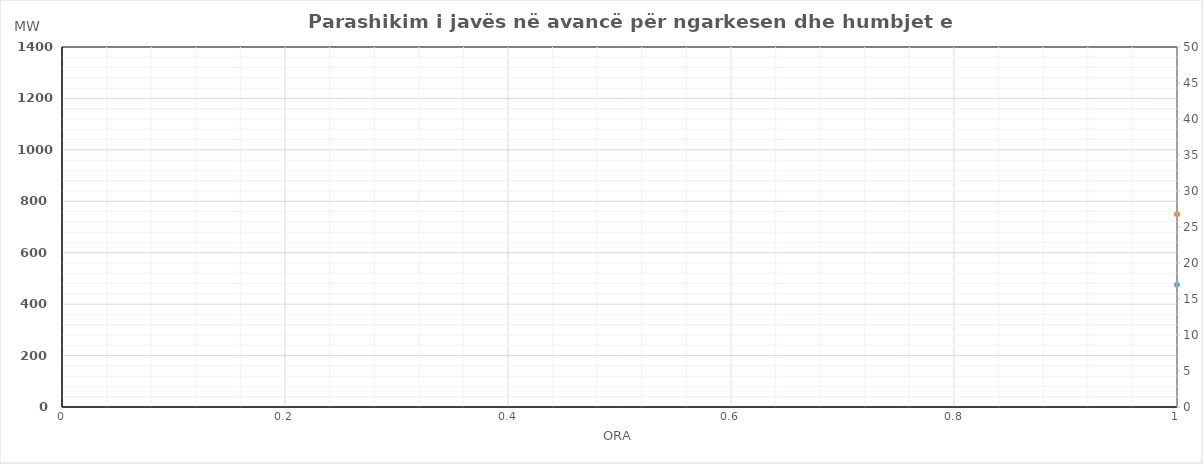
| Category | Ngarkesa (MWh) |
|---|---|
| 0 | 749.64 |
| 1 | 694.37 |
| 2 | 655.05 |
| 3 | 634.17 |
| 4 | 625.87 |
| 5 | 649.06 |
| 6 | 720.22 |
| 7 | 848.72 |
| 8 | 953.55 |
| 9 | 1019.8 |
| 10 | 1053.34 |
| 11 | 1095.81 |
| 12 | 1125.8 |
| 13 | 1153.63 |
| 14 | 1148.41 |
| 15 | 1136.43 |
| 16 | 1120.55 |
| 17 | 1125.63 |
| 18 | 1141.72 |
| 19 | 1145.83 |
| 20 | 1165.38 |
| 21 | 1087.88 |
| 22 | 983 |
| 23 | 861.19 |
| 24 | 716.54 |
| 25 | 652.86 |
| 26 | 620.14 |
| 27 | 604.22 |
| 28 | 606.84 |
| 29 | 625.22 |
| 30 | 720.76 |
| 31 | 857.74 |
| 32 | 945.24 |
| 33 | 977.65 |
| 34 | 989.05 |
| 35 | 1004.92 |
| 36 | 990.34 |
| 37 | 997.01 |
| 38 | 972.61 |
| 39 | 949.69 |
| 40 | 946 |
| 41 | 979.92 |
| 42 | 1030.52 |
| 43 | 1059.36 |
| 44 | 1116.1 |
| 45 | 1044.67 |
| 46 | 927.16 |
| 47 | 805.53 |
| 48 | 748.94 |
| 49 | 673.51 |
| 50 | 637.01 |
| 51 | 616.71 |
| 52 | 609.11 |
| 53 | 627.58 |
| 54 | 687.95 |
| 55 | 784.11 |
| 56 | 867.22 |
| 57 | 920.1 |
| 58 | 955.3 |
| 59 | 992.22 |
| 60 | 1023.69 |
| 61 | 995.77 |
| 62 | 981 |
| 63 | 983.23 |
| 64 | 1009.67 |
| 65 | 1069.76 |
| 66 | 1120.02 |
| 67 | 1151.8 |
| 68 | 1196.53 |
| 69 | 1123.1 |
| 70 | 1006.71 |
| 71 | 877.13 |
| 72 | 640.57 |
| 73 | 581.53 |
| 74 | 550.22 |
| 75 | 534.24 |
| 76 | 533.21 |
| 77 | 563.13 |
| 78 | 639.2 |
| 79 | 757.28 |
| 80 | 841.59 |
| 81 | 877.02 |
| 82 | 888.29 |
| 83 | 918.61 |
| 84 | 965.35 |
| 85 | 976.27 |
| 86 | 960.03 |
| 87 | 945.75 |
| 88 | 944.26 |
| 89 | 968.7 |
| 90 | 999.93 |
| 91 | 1020.22 |
| 92 | 1059.38 |
| 93 | 991.97 |
| 94 | 892.1 |
| 95 | 778.69 |
| 96 | 705.18 |
| 97 | 641.34 |
| 98 | 604.72 |
| 99 | 586.92 |
| 100 | 582.41 |
| 101 | 607.72 |
| 102 | 693.28 |
| 103 | 814.89 |
| 104 | 910.79 |
| 105 | 952.26 |
| 106 | 965.46 |
| 107 | 991.2 |
| 108 | 1017.1 |
| 109 | 1033.12 |
| 110 | 1024.33 |
| 111 | 1016.02 |
| 112 | 1016.01 |
| 113 | 1039.23 |
| 114 | 1073.13 |
| 115 | 1102.67 |
| 116 | 1113.82 |
| 117 | 1057.6 |
| 118 | 947.11 |
| 119 | 822.26 |
| 120 | 721.06 |
| 121 | 654.77 |
| 122 | 618.42 |
| 123 | 598.18 |
| 124 | 600.86 |
| 125 | 635.33 |
| 126 | 725.82 |
| 127 | 842.71 |
| 128 | 931.91 |
| 129 | 970.85 |
| 130 | 984.36 |
| 131 | 1003.96 |
| 132 | 1012.45 |
| 133 | 1035.75 |
| 134 | 1018.16 |
| 135 | 1001.95 |
| 136 | 1015.46 |
| 137 | 1051.54 |
| 138 | 1099.87 |
| 139 | 1128.07 |
| 140 | 1149.42 |
| 141 | 1080.69 |
| 142 | 968.8 |
| 143 | 844.63 |
| 144 | 749.13 |
| 145 | 680.29 |
| 146 | 642.48 |
| 147 | 621.98 |
| 148 | 617.56 |
| 149 | 637.92 |
| 150 | 726.27 |
| 151 | 852.99 |
| 152 | 952.55 |
| 153 | 1000.35 |
| 154 | 1006.99 |
| 155 | 1016.18 |
| 156 | 1029.12 |
| 157 | 1072.6 |
| 158 | 1060.16 |
| 159 | 1039.16 |
| 160 | 1058.27 |
| 161 | 1077.27 |
| 162 | 1095.89 |
| 163 | 1101.89 |
| 164 | 1120.34 |
| 165 | 1097.95 |
| 166 | 992.26 |
| 167 | 859.3 |